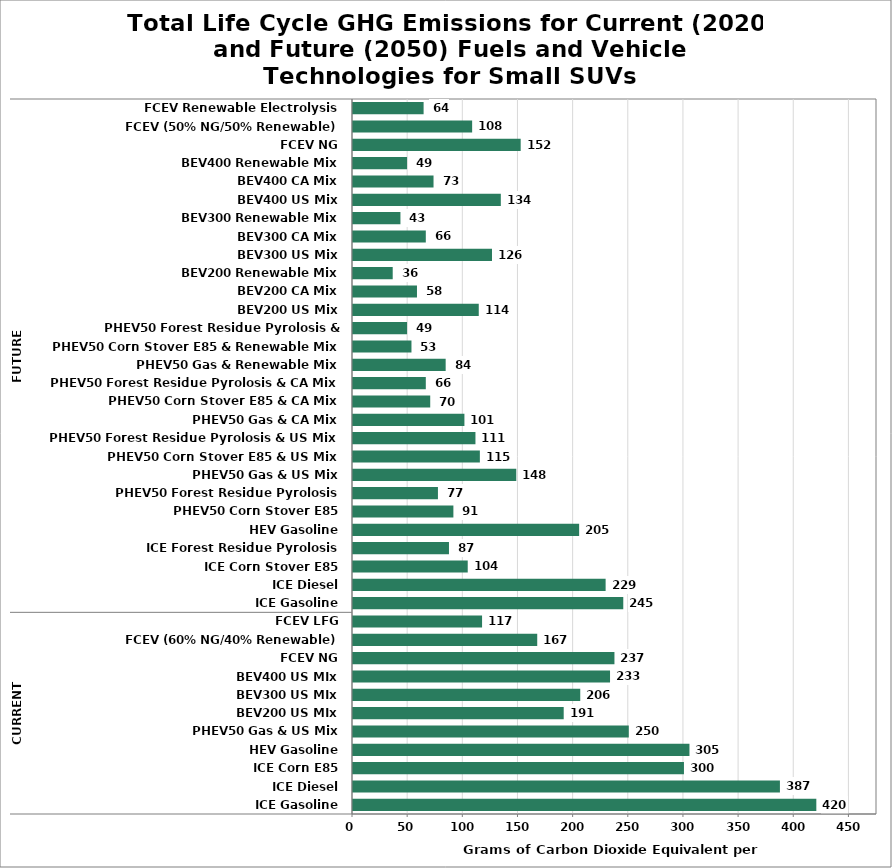
| Category | Grams of CO2 per Mile |
|---|---|
| 0 | 420 |
| 1 | 387 |
| 2 | 300 |
| 3 | 305 |
| 4 | 250 |
| 5 | 191 |
| 6 | 206 |
| 7 | 233 |
| 8 | 237 |
| 9 | 167 |
| 10 | 117 |
| 11 | 245 |
| 12 | 229 |
| 13 | 104 |
| 14 | 87 |
| 15 | 205 |
| 16 | 91 |
| 17 | 77 |
| 18 | 148 |
| 19 | 115 |
| 20 | 111 |
| 21 | 101 |
| 22 | 70 |
| 23 | 66 |
| 24 | 84 |
| 25 | 53 |
| 26 | 49 |
| 27 | 114 |
| 28 | 58 |
| 29 | 36 |
| 30 | 126 |
| 31 | 66 |
| 32 | 43 |
| 33 | 134 |
| 34 | 73 |
| 35 | 49 |
| 36 | 152 |
| 37 | 108 |
| 38 | 64 |